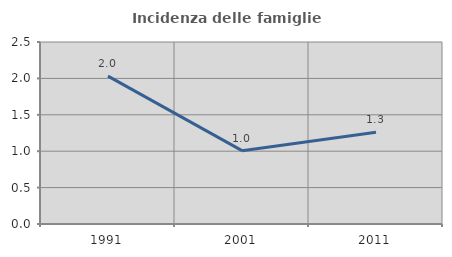
| Category | Incidenza delle famiglie numerose |
|---|---|
| 1991.0 | 2.032 |
| 2001.0 | 1.008 |
| 2011.0 | 1.261 |